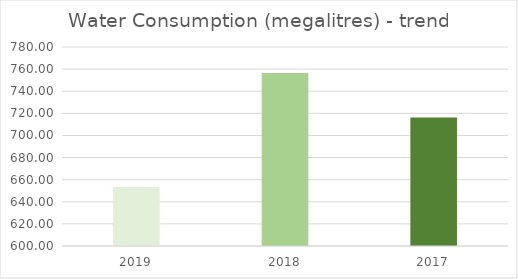
| Category | Series 0 |
|---|---|
| 0 | 653.46 |
| 1 | 756.42 |
| 2 | 716.16 |